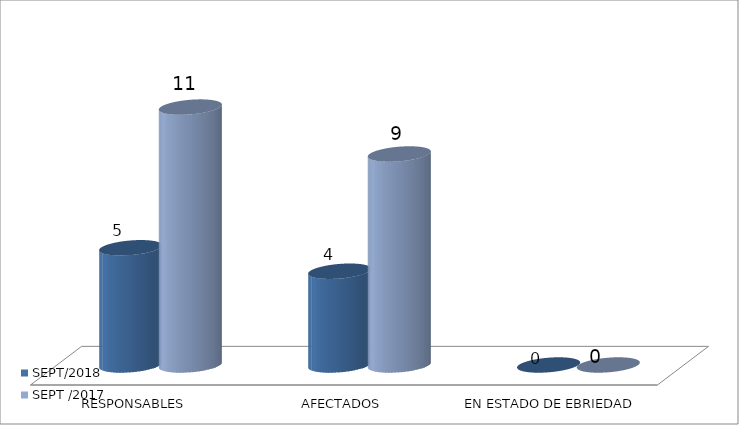
| Category | SEPT/2018 | SEPT /2017 |
|---|---|---|
| RESPONSABLES | 5 | 11 |
| AFECTADOS | 4 | 9 |
| EN ESTADO DE EBRIEDAD | 0 | 0 |